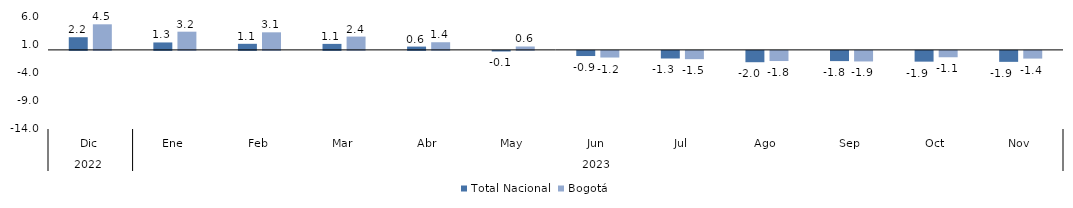
| Category | Total Nacional | Bogotá |
|---|---|---|
| 0 | 2.245 | 4.529 |
| 1 | 1.319 | 3.225 |
| 2 | 1.078 | 3.113 |
| 3 | 1.066 | 2.357 |
| 4 | 0.586 | 1.355 |
| 5 | -0.103 | 0.603 |
| 6 | -0.909 | -1.173 |
| 7 | -1.344 | -1.465 |
| 8 | -2.004 | -1.794 |
| 9 | -1.805 | -1.869 |
| 10 | -1.903 | -1.125 |
| 11 | -1.939 | -1.361 |